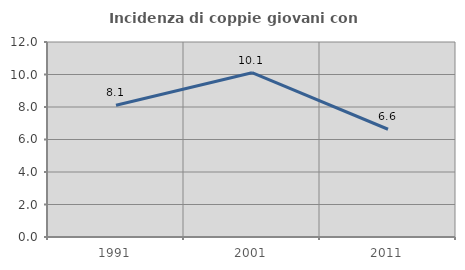
| Category | Incidenza di coppie giovani con figli |
|---|---|
| 1991.0 | 8.108 |
| 2001.0 | 10.109 |
| 2011.0 | 6.631 |